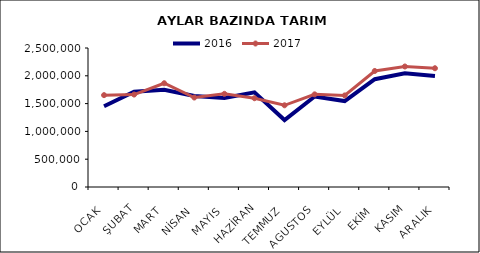
| Category | 2016 | 2017 |
|---|---|---|
| OCAK | 1451956.873 | 1652170.454 |
| ŞUBAT | 1713742.347 | 1662846.815 |
| MART | 1749514.77 | 1866126.157 |
| NİSAN | 1635707.906 | 1609152.165 |
| MAYIS | 1600196.594 | 1675542.416 |
| HAZİRAN | 1702995.456 | 1596589.889 |
| TEMMUZ | 1204892.82 | 1469569.106 |
| AGUSTOS | 1627068.37 | 1666204.315 |
| EYLÜL | 1545889.575 | 1646904.303 |
| EKİM | 1938706.909 | 2086678.948 |
| KASIM | 2043538.59 | 2167351.202 |
| ARALIK | 1996908.807 | 2135953.642 |